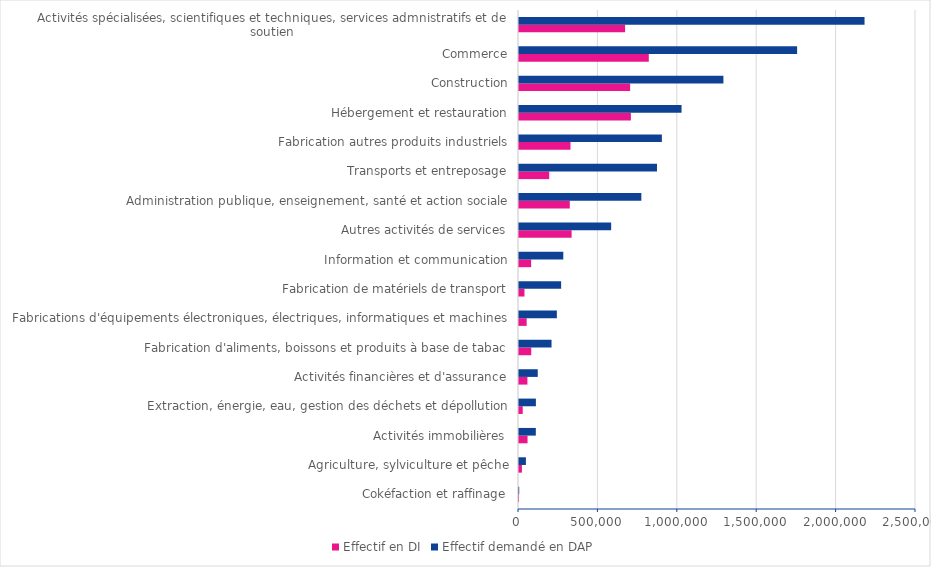
| Category | Effectif en DI | Effectif demandé en DAP |
|---|---|---|
| Cokéfaction et raffinage | 157 | 1366 |
| Agriculture, sylviculture et pêche | 18389 | 43498 |
| Activités immobilières | 53826 | 105905 |
| Extraction, énergie, eau, gestion des déchets et dépollution | 23472 | 106396 |
| Activités financières et d'assurance | 53031 | 118117 |
| Fabrication d'aliments, boissons et produits à base de tabac | 76983 | 204884 |
| Fabrications d'équipements électroniques, électriques, informatiques et machines | 48226 | 238425 |
| Fabrication de matériels de transport | 34468 | 265337 |
| Information et communication | 76506 | 278948 |
| Autres activités de services | 331266 | 580325 |
| Administration publique, enseignement, santé et action sociale | 319988 | 770467 |
| Transports et entreposage | 190266 | 868959 |
| Fabrication autres produits industriels | 324264 | 899719 |
| Hébergement et restauration | 704680 | 1023658 |
| Construction | 699851 | 1287162 |
| Commerce | 817303 | 1751327 |
| Activités spécialisées, scientifiques et techniques, services admnistratifs et de soutien | 668053 | 2175954 |